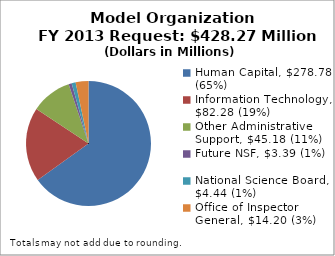
| Category | Series 0 |
|---|---|
| Human Capital, $278.78 (65%) | 278.78 |
| Information Technology, $82.28 (19%) | 82.28 |
| Other Administrative Support, $45.18 (11%) | 45.18 |
| Future NSF, $3.39 (1%) | 3.39 |
| National Science Board, $4.44 (1%) | 4.44 |
| Office of Inspector General, $14.20 (3%) | 14.2 |